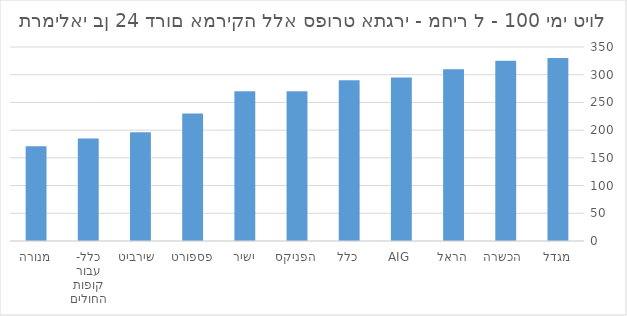
| Category | תכנית בסיס |
|---|---|
| מגדל | 330 |
| הכשרה  | 325 |
| הראל | 310 |
| AIG | 295 |
| כלל | 290 |
| הפניקס | 270 |
| ישיר | 270 |
| פספורט | 230 |
| שירביט  | 196 |
| כלל- עבור קופות החולים | 185 |
| מנורה | 171 |